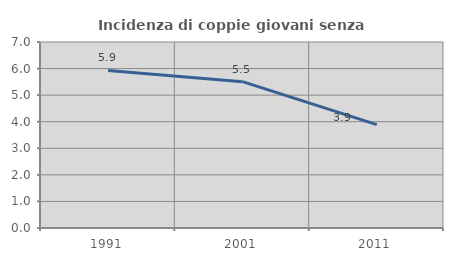
| Category | Incidenza di coppie giovani senza figli |
|---|---|
| 1991.0 | 5.928 |
| 2001.0 | 5.508 |
| 2011.0 | 3.89 |